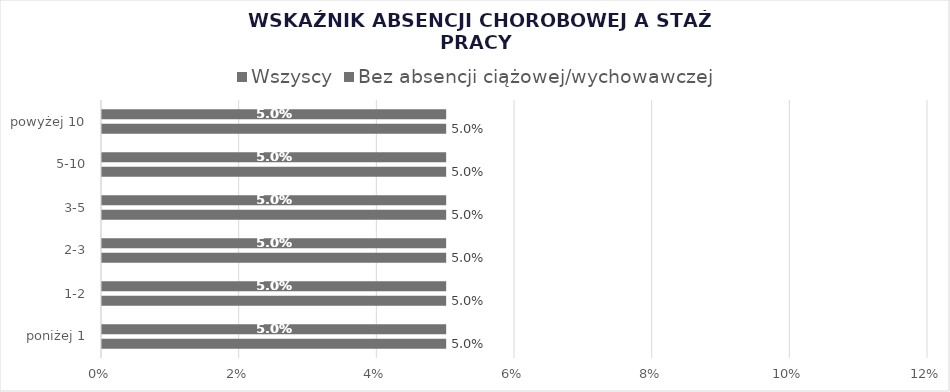
| Category | Wszyscy | Bez absencji ciążowej/wychowawczej |
|---|---|---|
| poniżej 1 | 0.05 | 0.05 |
| 1-2 | 0.05 | 0.05 |
| 2-3 | 0.05 | 0.05 |
| 3-5 | 0.05 | 0.05 |
| 5-10 | 0.05 | 0.05 |
| powyżej 10 | 0.05 | 0.05 |